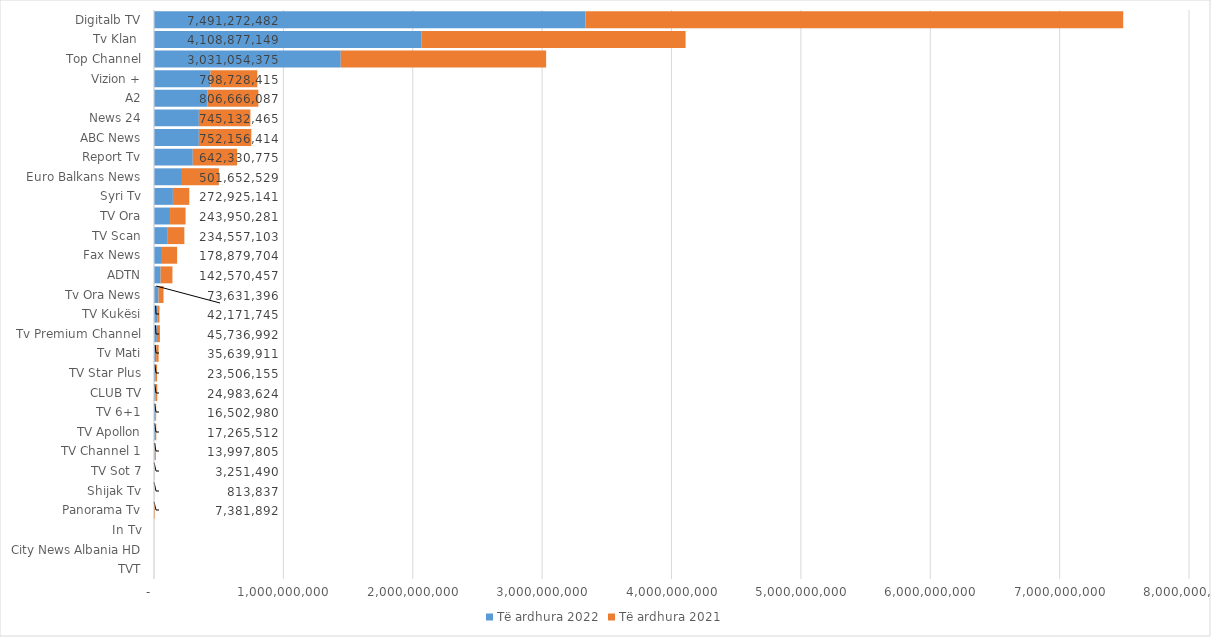
| Category | Të ardhura 2022 | Të ardhura 2021 |
|---|---|---|
| TVT | 0 | 0 |
| City News Albania HD | 0 | 0 |
| In Tv | 0 | 0 |
| Panorama Tv | 210242 | 7171650 |
| Shijak Tv | 347039 | 466798 |
| TV Sot 7 | 1869101 | 1382389 |
| TV Channel 1 | 4605285 | 9392520 |
| TV Apollon | 8025222 | 9240290 |
| TV 6+1 | 9904980 | 6598000 |
| CLUB TV | 11307650 | 13675974 |
| TV Star Plus | 13464616 | 10041539 |
| Tv Mati | 16898946 | 18740965 |
| Tv Premium Channel | 22152200 | 23584792 |
| TV Kukësi | 24814278 | 17357467 |
| Tv Ora News | 35062900 | 38568496 |
| ADTN | 51151078 | 91419379 |
| Fax News | 53924547 | 124955157 |
| TV Scan | 106662878 | 127894225 |
| TV Ora | 124075035 | 119875246 |
| Syri Tv | 145982192 | 126942949 |
| Euro Balkans News | 216141281 | 285511248 |
| Report Tv | 299795327 | 342535448 |
| ABC News | 346698061 | 405458353 |
| News 24 | 346906821 | 398225644 |
| A2 | 414768795 | 391897292 |
| Vizion + | 436336452 | 362391963 |
| Top Channel | 1443417716 | 1587636659 |
| Tv Klan  | 2068823675 | 2040053474 |
| Digitalb TV | 3335297685 | 4155974797 |